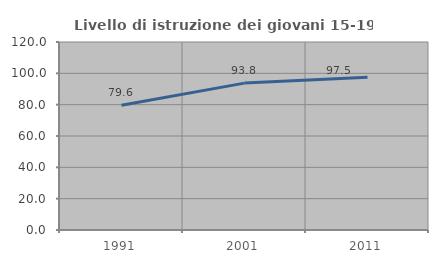
| Category | Livello di istruzione dei giovani 15-19 anni |
|---|---|
| 1991.0 | 79.589 |
| 2001.0 | 93.764 |
| 2011.0 | 97.493 |